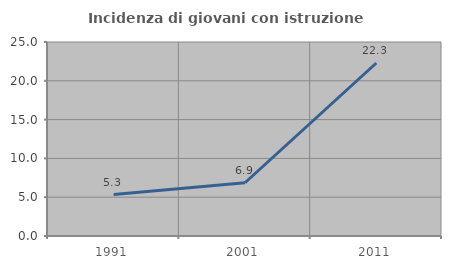
| Category | Incidenza di giovani con istruzione universitaria |
|---|---|
| 1991.0 | 5.333 |
| 2001.0 | 6.863 |
| 2011.0 | 22.293 |